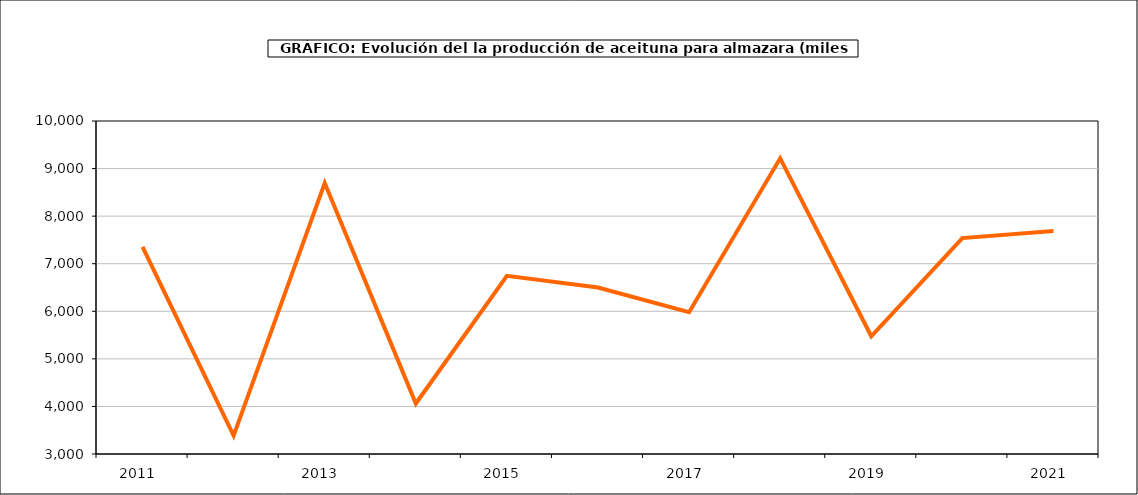
| Category | producción |
|---|---|
| 2011.0 | 7352.697 |
| 2012.0 | 3387.3 |
| 2013.0 | 8695.861 |
| 2014.0 | 4060.978 |
| 2015.0 | 6745.306 |
| 2016.0 | 6499.902 |
| 2017.0 | 5979.204 |
| 2018.0 | 9215.5 |
| 2019.0 | 5475.356 |
| 2020.0 | 7538.91 |
| 2021.0 | 7687.565 |